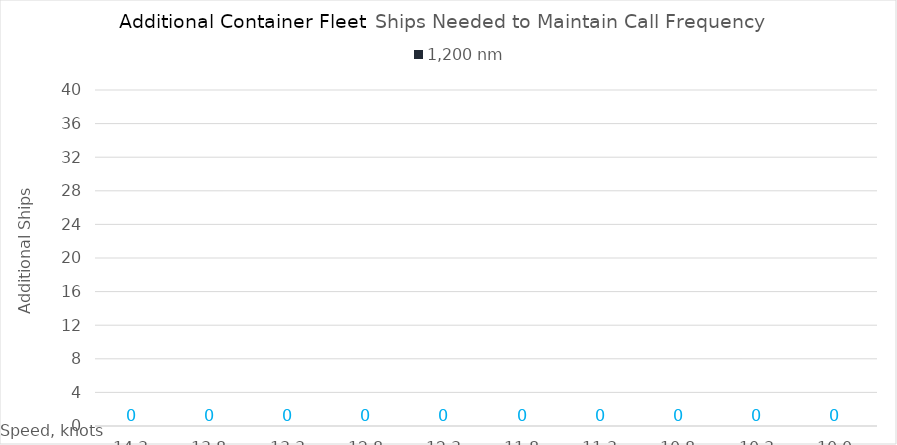
| Category | 1,200 |
|---|---|
| 14.3 | 0 |
| 13.8 | 0 |
| 13.3 | 0 |
| 12.8 | 0 |
| 12.3 | 0 |
| 11.8 | 0 |
| 11.3 | 0 |
| 10.8 | 0 |
| 10.3 | 0 |
| 10.0 | 0 |